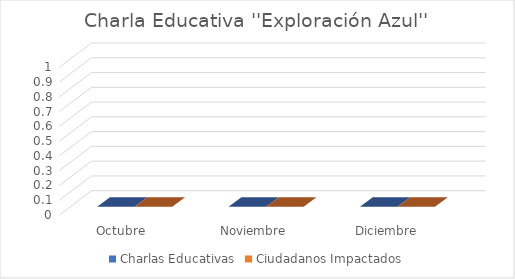
| Category | Charlas Educativas | Ciudadanos Impactados |
|---|---|---|
| Octubre  | 0 | 0 |
| Noviembre  | 0 | 0 |
| Diciembre | 0 | 0 |